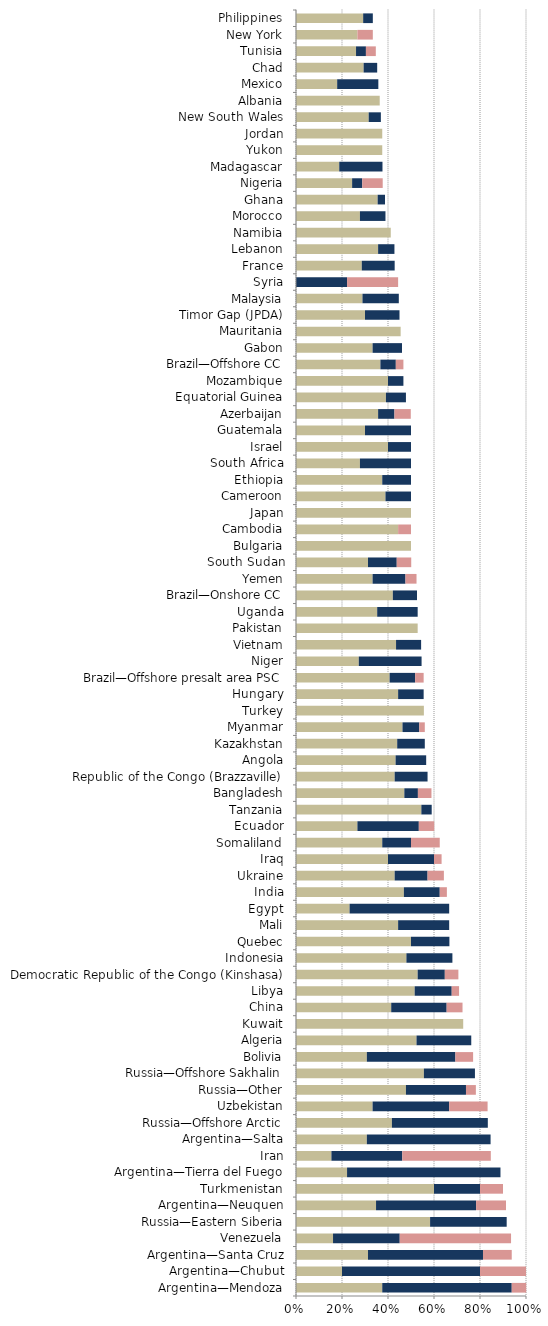
| Category |   Mild deterrent to investment |   Strong deterrent to investment |   Would not pursue investment due to this factor |
|---|---|---|---|
| Argentina—Mendoza | 0.375 | 0.563 | 0.063 |
| Argentina—Chubut | 0.2 | 0.6 | 0.2 |
| Argentina—Santa Cruz | 0.313 | 0.5 | 0.125 |
| Venezuela | 0.161 | 0.29 | 0.484 |
| Russia—Eastern Siberia | 0.583 | 0.333 | 0 |
| Argentina—Neuquen | 0.348 | 0.435 | 0.13 |
| Turkmenistan | 0.6 | 0.2 | 0.1 |
| Argentina—Tierra del Fuego | 0.222 | 0.667 | 0 |
| Iran | 0.154 | 0.308 | 0.385 |
| Argentina—Salta | 0.308 | 0.538 | 0 |
| Russia—Offshore Arctic | 0.417 | 0.417 | 0 |
| Uzbekistan | 0.333 | 0.333 | 0.167 |
| Russia—Other | 0.478 | 0.261 | 0.043 |
| Russia—Offshore Sakhalin | 0.556 | 0.222 | 0 |
| Bolivia | 0.308 | 0.385 | 0.077 |
| Algeria | 0.524 | 0.238 | 0 |
| Kuwait | 0.727 | 0 | 0 |
| China | 0.414 | 0.241 | 0.069 |
| Libya | 0.516 | 0.161 | 0.032 |
| Democratic Republic of the Congo (Kinshasa) | 0.529 | 0.118 | 0.059 |
| Indonesia | 0.48 | 0.2 | 0 |
| Quebec | 0.5 | 0.167 | 0 |
| Mali | 0.444 | 0.222 | 0 |
| Egypt | 0.233 | 0.433 | 0 |
| India | 0.469 | 0.156 | 0.031 |
| Ukraine | 0.429 | 0.143 | 0.071 |
| Iraq | 0.4 | 0.2 | 0.033 |
| Somaliland | 0.375 | 0.125 | 0.125 |
| Ecuador | 0.267 | 0.267 | 0.067 |
| Tanzania | 0.545 | 0.045 | 0 |
| Bangladesh | 0.471 | 0.059 | 0.059 |
| Republic of the Congo (Brazzaville) | 0.429 | 0.143 | 0 |
| Angola | 0.433 | 0.133 | 0 |
| Kazakhstan | 0.44 | 0.12 | 0 |
| Myanmar | 0.463 | 0.073 | 0.024 |
| Turkey | 0.556 | 0 | 0 |
| Hungary | 0.444 | 0.111 | 0 |
| Brazil—Offshore presalt area PSC | 0.407 | 0.111 | 0.037 |
| Niger | 0.273 | 0.273 | 0 |
| Vietnam | 0.435 | 0.109 | 0 |
| Pakistan | 0.529 | 0 | 0 |
| Uganda | 0.353 | 0.176 | 0 |
| Brazil—Onshore CC | 0.421 | 0.105 | 0 |
| Yemen | 0.333 | 0.143 | 0.048 |
| South Sudan | 0.313 | 0.125 | 0.063 |
| Bulgaria | 0.5 | 0 | 0 |
| Cambodia | 0.444 | 0 | 0.056 |
| Japan | 0.5 | 0 | 0 |
| Cameroon | 0.389 | 0.111 | 0 |
| Ethiopia | 0.375 | 0.125 | 0 |
| South Africa | 0.278 | 0.222 | 0 |
| Israel | 0.4 | 0.1 | 0 |
| Guatemala | 0.3 | 0.2 | 0 |
| Azerbaijan | 0.357 | 0.071 | 0.071 |
| Equatorial Guinea | 0.391 | 0.087 | 0 |
| Mozambique | 0.4 | 0.067 | 0 |
| Brazil—Offshore CC | 0.367 | 0.067 | 0.033 |
| Gabon | 0.333 | 0.128 | 0 |
| Mauritania | 0.455 | 0 | 0 |
| Timor Gap (JPDA) | 0.3 | 0.15 | 0 |
| Malaysia | 0.289 | 0.158 | 0 |
| Syria | 0 | 0.222 | 0.222 |
| France | 0.286 | 0.143 | 0 |
| Lebanon | 0.357 | 0.071 | 0 |
| Namibia | 0.412 | 0 | 0 |
| Morocco | 0.278 | 0.111 | 0 |
| Ghana | 0.355 | 0.032 | 0 |
| Nigeria | 0.244 | 0.044 | 0.089 |
| Madagascar | 0.188 | 0.188 | 0 |
| Yukon | 0.375 | 0 | 0 |
| Jordan | 0.375 | 0 | 0 |
| New South Wales | 0.316 | 0.053 | 0 |
| Albania | 0.364 | 0 | 0 |
| Mexico | 0.179 | 0.179 | 0 |
| Chad | 0.294 | 0.059 | 0 |
| Tunisia | 0.261 | 0.043 | 0.043 |
| New York | 0.267 | 0 | 0.067 |
| Philippines | 0.292 | 0.042 | 0 |